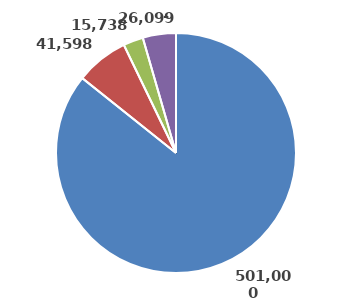
| Category | Series 0 |
|---|---|
| Neučinkovitost | 501000 |
| Bolovanja | 41597.92 |
| Fluktuacija | 15737.5 |
| Ozljede na radu | 26098.55 |
| Štrajkovi | 0 |